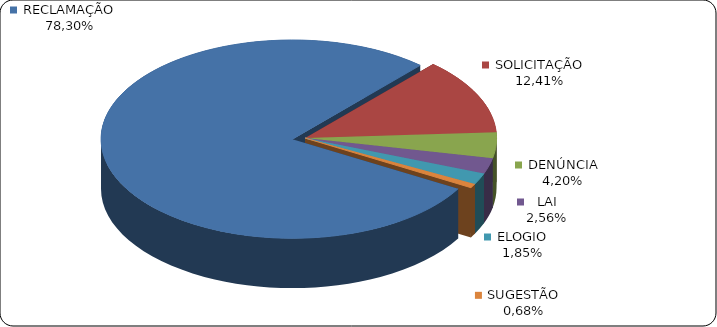
| Category | Series 0 |
|---|---|
|      RECLAMAÇÃO | 0.783 |
|      SOLICITAÇÃO | 0.124 |
|      DENÚNCIA | 0.042 |
|      LAI | 0.026 |
|      ELOGIO | 0.018 |
|      SUGESTÃO | 0.007 |